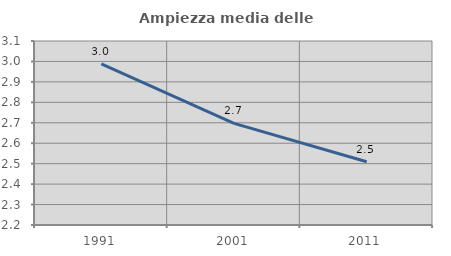
| Category | Ampiezza media delle famiglie |
|---|---|
| 1991.0 | 2.988 |
| 2001.0 | 2.697 |
| 2011.0 | 2.509 |